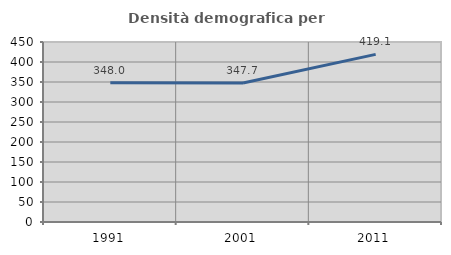
| Category | Densità demografica |
|---|---|
| 1991.0 | 348.029 |
| 2001.0 | 347.716 |
| 2011.0 | 419.094 |